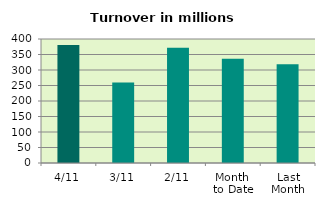
| Category | Series 0 |
|---|---|
| 4/11 | 380.76 |
| 3/11 | 259.92 |
| 2/11 | 371.617 |
| Month 
to Date | 336.542 |
| Last
Month | 318.176 |